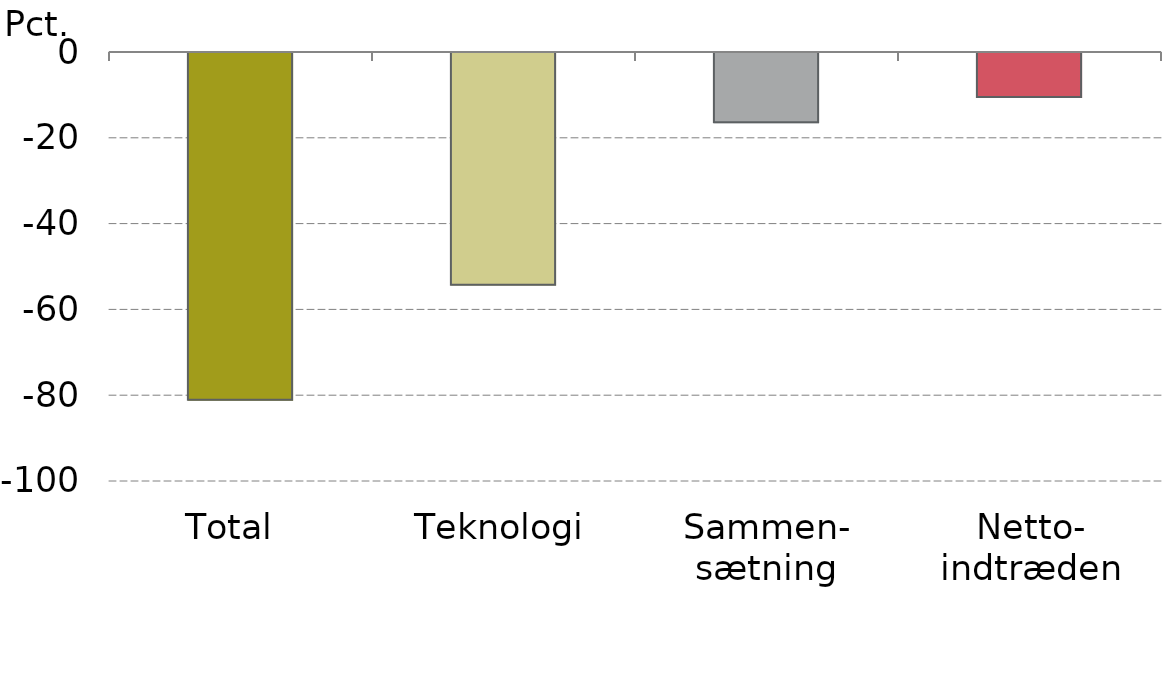
| Category | #REF! |
|---|---|
| Total  | -81.08 |
| Teknologi | -54.264 |
| Sammen-
sætning | -16.348 |
| Netto-
indtræden | -10.468 |